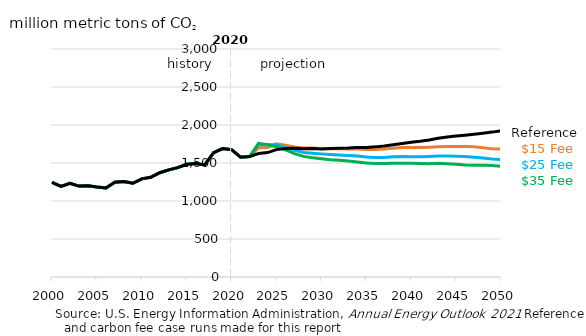
| Category | $15 Fee case | $25 Fee case | $35 Fee case | Reference |
|---|---|---|---|---|
| 2000.0 | 1246.175 | 1246.175 | 1246.175 | 1246.175 |
| 2001.0 | 1192.709 | 1192.709 | 1192.709 | 1192.709 |
| 2002.0 | 1231.362 | 1231.362 | 1231.362 | 1231.362 |
| 2003.0 | 1196.331 | 1196.331 | 1196.331 | 1196.331 |
| 2004.0 | 1201.327 | 1201.327 | 1201.327 | 1201.327 |
| 2005.0 | 1183.404 | 1183.404 | 1183.404 | 1183.404 |
| 2006.0 | 1170.626 | 1170.626 | 1170.626 | 1170.626 |
| 2007.0 | 1245.859 | 1245.859 | 1245.859 | 1245.859 |
| 2008.0 | 1255.23 | 1255.23 | 1255.23 | 1255.23 |
| 2009.0 | 1233.514 | 1233.514 | 1233.514 | 1233.514 |
| 2010.0 | 1291.544 | 1291.544 | 1291.544 | 1291.544 |
| 2011.0 | 1311.423 | 1311.423 | 1311.423 | 1311.423 |
| 2012.0 | 1371.562 | 1371.562 | 1371.562 | 1371.562 |
| 2013.0 | 1409.352 | 1409.352 | 1409.352 | 1409.352 |
| 2014.0 | 1439.527 | 1439.527 | 1439.527 | 1439.527 |
| 2015.0 | 1482.986 | 1482.986 | 1482.986 | 1482.986 |
| 2016.0 | 1493.981 | 1493.981 | 1493.981 | 1493.981 |
| 2017.0 | 1475.041 | 1475.041 | 1475.041 | 1475.041 |
| 2018.0 | 1635.593 | 1635.593 | 1635.593 | 1635.593 |
| 2019.0 | 1689.155 | 1689.155 | 1689.155 | 1689.155 |
| 2020.0 | 1675.207 | 1675.207 | 1675.207 | 1675.207 |
| 2021.0 | 1575.721 | 1576.191 | 1576.601 | 1575.86 |
| 2022.0 | 1584.982 | 1584.393 | 1585.323 | 1584.311 |
| 2023.0 | 1699.566 | 1741.126 | 1758.026 | 1624.369 |
| 2024.0 | 1705.055 | 1743.584 | 1739.054 | 1636.765 |
| 2025.0 | 1752.438 | 1737.199 | 1713.774 | 1675.976 |
| 2026.0 | 1734.681 | 1706.417 | 1672.098 | 1692.1 |
| 2027.0 | 1712.253 | 1667.947 | 1622.939 | 1692.768 |
| 2028.0 | 1698.37 | 1637.557 | 1587.239 | 1687.022 |
| 2029.0 | 1697.965 | 1628.759 | 1568.838 | 1689.629 |
| 2030.0 | 1686.621 | 1620.087 | 1556.25 | 1683.333 |
| 2031.0 | 1686.64 | 1612.885 | 1543.547 | 1691.25 |
| 2032.0 | 1688.182 | 1606.178 | 1537.383 | 1694.448 |
| 2033.0 | 1684.846 | 1599.966 | 1525.359 | 1698.315 |
| 2034.0 | 1683.27 | 1592.953 | 1513.536 | 1705.333 |
| 2035.0 | 1679.26 | 1578.164 | 1499.52 | 1705.086 |
| 2036.0 | 1678.456 | 1572.068 | 1494.371 | 1712.237 |
| 2037.0 | 1683.039 | 1573.816 | 1494.754 | 1724.382 |
| 2038.0 | 1694.425 | 1581.362 | 1498.052 | 1741.037 |
| 2039.0 | 1702.361 | 1586.523 | 1497.875 | 1757.415 |
| 2040.0 | 1704.8 | 1582.8 | 1496.27 | 1774.251 |
| 2041.0 | 1702.352 | 1581.876 | 1493.069 | 1784.941 |
| 2042.0 | 1708.261 | 1586.328 | 1491.641 | 1803.305 |
| 2043.0 | 1713.654 | 1592.137 | 1495.475 | 1825.049 |
| 2044.0 | 1717.613 | 1591.401 | 1488.822 | 1840.999 |
| 2045.0 | 1718.583 | 1588.153 | 1484.564 | 1854.168 |
| 2046.0 | 1715.793 | 1584.412 | 1475.027 | 1866.415 |
| 2047.0 | 1712.24 | 1575.988 | 1470.894 | 1878.144 |
| 2048.0 | 1699.635 | 1566.788 | 1469.808 | 1892.236 |
| 2049.0 | 1688.542 | 1552.354 | 1465.989 | 1906.416 |
| 2050.0 | 1684.969 | 1543.859 | 1457.172 | 1923.587 |